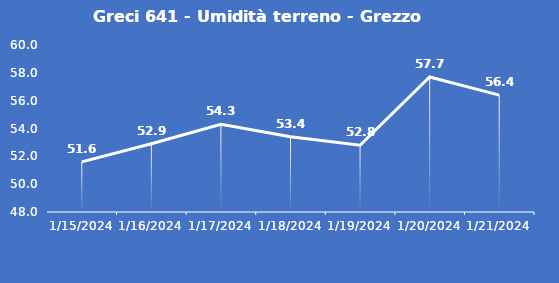
| Category | Greci 641 - Umidità terreno - Grezzo (%VWC) |
|---|---|
| 1/15/24 | 51.6 |
| 1/16/24 | 52.9 |
| 1/17/24 | 54.3 |
| 1/18/24 | 53.4 |
| 1/19/24 | 52.8 |
| 1/20/24 | 57.7 |
| 1/21/24 | 56.4 |